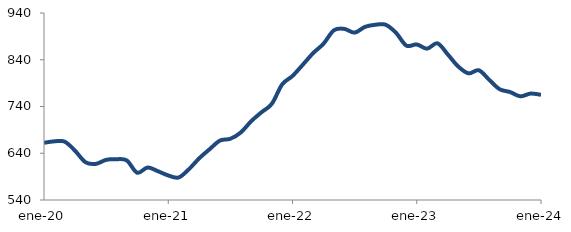
| Category | Series 0 |
|---|---|
| 2020-01-01 | 662.344 |
| 2020-02-01 | 665.471 |
| 2020-03-01 | 664.712 |
| 2020-04-01 | 645.351 |
| 2020-05-01 | 620.935 |
| 2020-06-01 | 617.256 |
| 2020-07-01 | 625.855 |
| 2020-08-01 | 627.288 |
| 2020-09-01 | 624.542 |
| 2020-10-01 | 598.351 |
| 2020-11-01 | 609.465 |
| 2020-12-01 | 601.605 |
| 2021-01-01 | 592.504 |
| 2021-02-01 | 588.185 |
| 2021-03-01 | 605.989 |
| 2021-04-01 | 629.446 |
| 2021-05-01 | 648.73 |
| 2021-06-01 | 667.177 |
| 2021-07-01 | 670.996 |
| 2021-08-01 | 684.389 |
| 2021-09-01 | 708.308 |
| 2021-10-01 | 727.608 |
| 2021-11-01 | 745.65 |
| 2021-12-01 | 787.184 |
| 2022-01-01 | 805.308 |
| 2022-02-01 | 829.502 |
| 2022-03-01 | 854.336 |
| 2022-04-01 | 874.453 |
| 2022-05-01 | 903.049 |
| 2022-06-01 | 906.022 |
| 2022-07-01 | 898.071 |
| 2022-08-01 | 910.353 |
| 2022-09-01 | 914.859 |
| 2022-10-01 | 914.857 |
| 2022-11-01 | 897.607 |
| 2022-12-01 | 870.196 |
| 2023-01-01 | 872.784 |
| 2023-02-01 | 863.736 |
| 2023-03-01 | 875.118 |
| 2023-04-01 | 851.276 |
| 2023-05-01 | 825.667 |
| 2023-06-01 | 810.924 |
| 2023-07-01 | 817.469 |
| 2023-08-01 | 797.001 |
| 2023-09-01 | 777.024 |
| 2023-10-01 | 770.975 |
| 2023-11-01 | 761.798 |
| 2023-12-01 | 767.626 |
| 2024-01-01 | 764.98 |